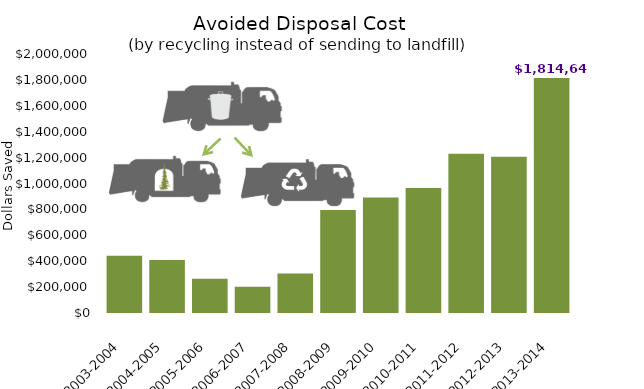
| Category | Series 0 |
|---|---|
| 2003-2004 | 441448 |
| 2004-2005 | 409423 |
| 2005-2006 | 264439 |
| 2006-2007 | 202229 |
| 2007-2008 | 305480 |
| 2008-2009 | 795984 |
| 2009-2010 | 892007 |
| 2010-2011 | 966033 |
| 2011-2012 | 1229504.93 |
| 2012-2013 | 1205941 |
| 2013-2014 | 1814648 |